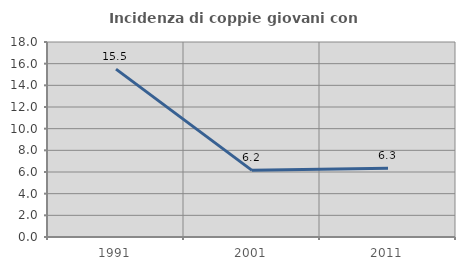
| Category | Incidenza di coppie giovani con figli |
|---|---|
| 1991.0 | 15.493 |
| 2001.0 | 6.154 |
| 2011.0 | 6.349 |